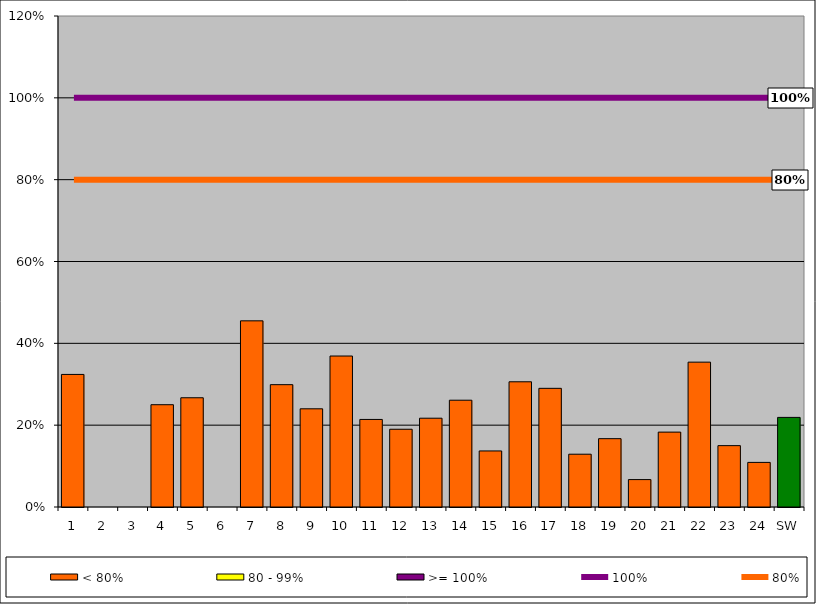
| Category | < 80% | 80 - 99% | >= 100% |
|---|---|---|---|
| 1 | 0.324 | 0 | 0 |
| 2 | 0 | 0 | 0 |
| 3 | 0 | 0 | 0 |
| 4 | 0.25 | 0 | 0 |
| 5 | 0.267 | 0 | 0 |
| 6 | 0 | 0 | 0 |
| 7 | 0.455 | 0 | 0 |
| 8 | 0.299 | 0 | 0 |
| 9 | 0.24 | 0 | 0 |
| 10 | 0.369 | 0 | 0 |
| 11 | 0.214 | 0 | 0 |
| 12 | 0.19 | 0 | 0 |
| 13 | 0.217 | 0 | 0 |
| 14 | 0.261 | 0 | 0 |
| 15 | 0.137 | 0 | 0 |
| 16 | 0.306 | 0 | 0 |
| 17 | 0.29 | 0 | 0 |
| 18 | 0.129 | 0 | 0 |
| 19 | 0.167 | 0 | 0 |
| 20 | 0.067 | 0 | 0 |
| 21 | 0.183 | 0 | 0 |
| 22 | 0.354 | 0 | 0 |
| 23 | 0.15 | 0 | 0 |
| 24 | 0.109 | 0 | 0 |
| SW | 0.219 | 0 | 0 |